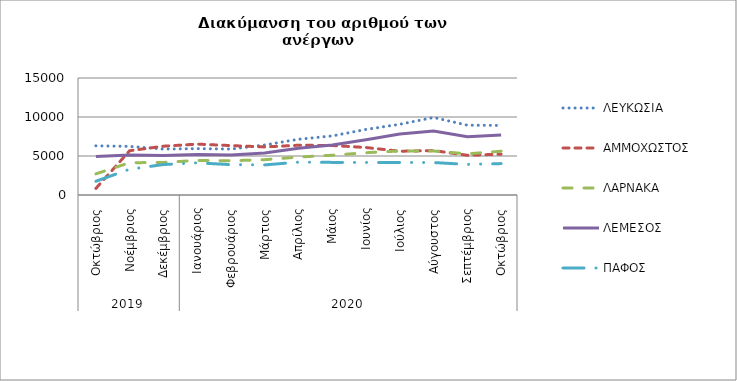
| Category | ΛΕΥΚΩΣΙΑ | ΑΜΜΟΧΩΣΤΟΣ | ΛΑΡΝΑΚΑ | ΛΕΜΕΣΟΣ | ΠΑΦΟΣ |
|---|---|---|---|---|---|
| 0 | 6306 | 843 | 2710 | 4922 | 1763 |
| 1 | 6231 | 5679 | 4139 | 5142 | 3304 |
| 2 | 5893 | 6256 | 4171 | 5061 | 3904 |
| 3 | 5943 | 6524 | 4433 | 5185 | 4129 |
| 4 | 5890 | 6335 | 4394 | 5114 | 3887 |
| 5 | 6416 | 6162 | 4527 | 5390 | 3858 |
| 6 | 7143 | 6380 | 4862 | 5992 | 4214 |
| 7 | 7576 | 6346 | 5099 | 6402 | 4181 |
| 8 | 8407 | 6088 | 5421 | 7072 | 4170 |
| 9 | 9066 | 5611 | 5646 | 7825 | 4165 |
| 10 | 9937 | 5694 | 5640 | 8215 | 4163 |
| 11 | 8952 | 5093 | 5276 | 7475 | 3922 |
| 12 | 8918 | 5236 | 5612 | 7695 | 4026 |